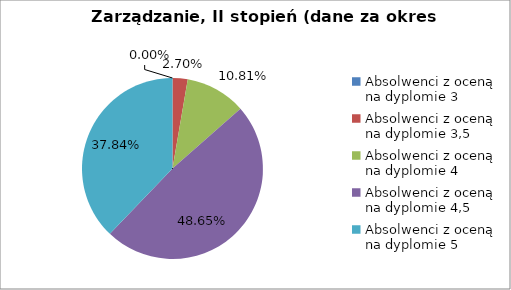
| Category | Series 0 |
|---|---|
| Absolwenci z oceną na dyplomie 3 | 0 |
| Absolwenci z oceną na dyplomie 3,5 | 2.703 |
| Absolwenci z oceną na dyplomie 4 | 10.811 |
| Absolwenci z oceną na dyplomie 4,5 | 48.649 |
| Absolwenci z oceną na dyplomie 5 | 37.838 |